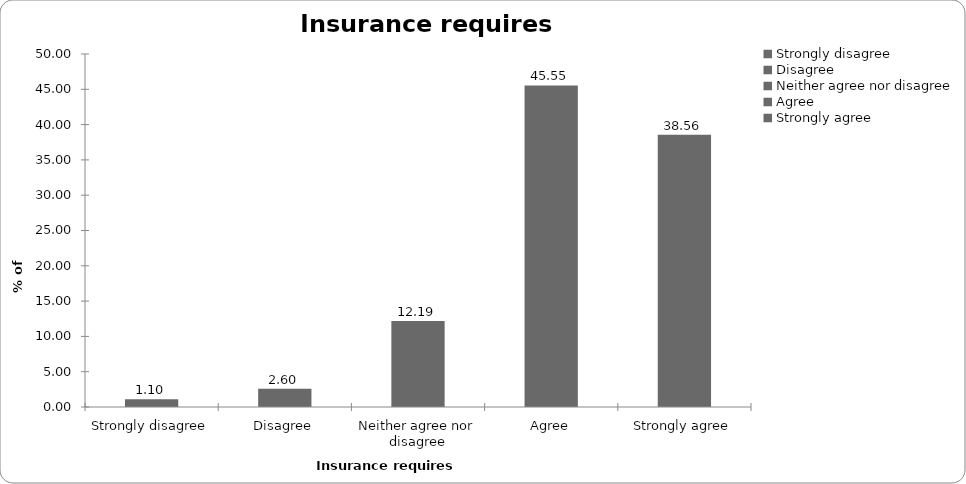
| Category | Insurance requires regulation |
|---|---|
| Strongly disagree | 1.099 |
| Disagree | 2.597 |
| Neither agree nor disagree | 12.188 |
| Agree | 45.554 |
| Strongly agree | 38.561 |